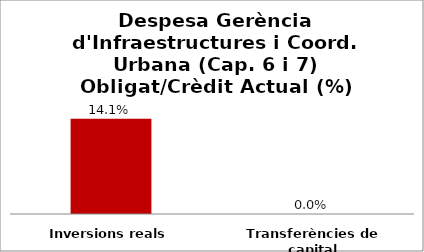
| Category | Series 0 |
|---|---|
| Inversions reals | 0.141 |
| Transferències de capital | 0 |